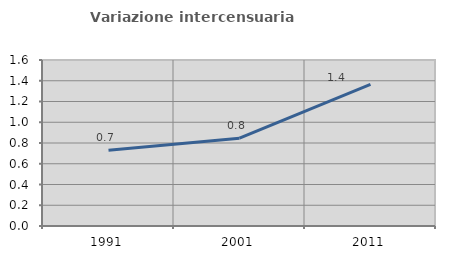
| Category | Variazione intercensuaria annua |
|---|---|
| 1991.0 | 0.73 |
| 2001.0 | 0.846 |
| 2011.0 | 1.366 |